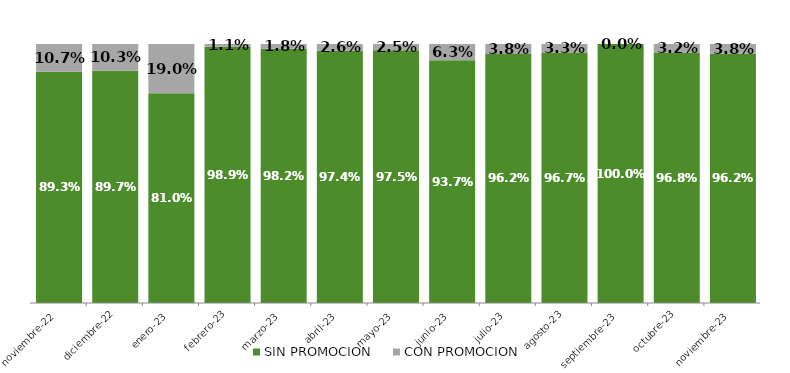
| Category | SIN PROMOCION   | CON PROMOCION   |
|---|---|---|
| 2022-11-01 | 0.893 | 0.107 |
| 2022-12-01 | 0.897 | 0.103 |
| 2023-01-01 | 0.81 | 0.19 |
| 2023-02-01 | 0.989 | 0.011 |
| 2023-03-01 | 0.982 | 0.018 |
| 2023-04-01 | 0.974 | 0.026 |
| 2023-05-01 | 0.975 | 0.025 |
| 2023-06-01 | 0.937 | 0.063 |
| 2023-07-01 | 0.962 | 0.038 |
| 2023-08-01 | 0.967 | 0.033 |
| 2023-09-01 | 1 | 0 |
| 2023-10-01 | 0.968 | 0.032 |
| 2023-11-01 | 0.962 | 0.038 |